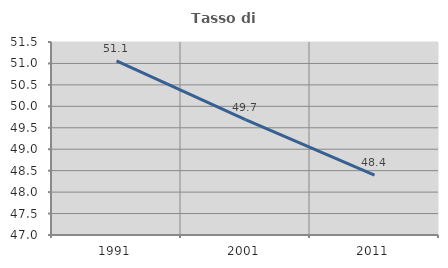
| Category | Tasso di occupazione   |
|---|---|
| 1991.0 | 51.062 |
| 2001.0 | 49.691 |
| 2011.0 | 48.394 |